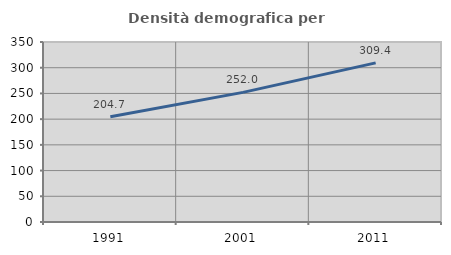
| Category | Densità demografica |
|---|---|
| 1991.0 | 204.728 |
| 2001.0 | 252.043 |
| 2011.0 | 309.419 |